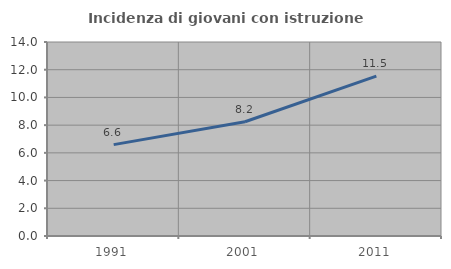
| Category | Incidenza di giovani con istruzione universitaria |
|---|---|
| 1991.0 | 6.593 |
| 2001.0 | 8.247 |
| 2011.0 | 11.538 |